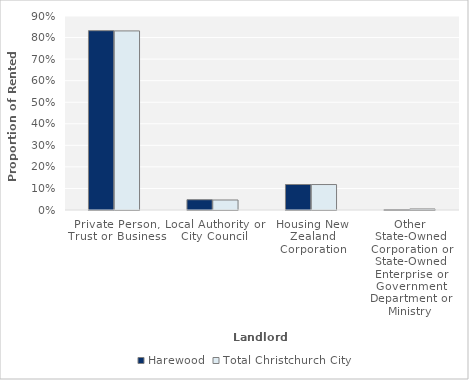
| Category | Harewood | Total Christchurch City |
|---|---|---|
| Private Person, Trust or Business | 0.832 | 0.831 |
| Local Authority or City Council | 0.048 | 0.046 |
| Housing New Zealand Corporation | 0.118 | 0.118 |
| Other State-Owned Corporation or State-Owned Enterprise or Government Department or Ministry | 0.002 | 0.005 |